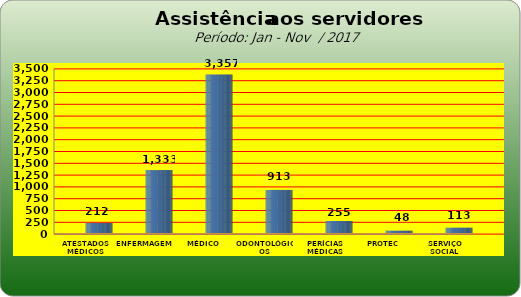
| Category | Series 0 |
|---|---|
| ATESTADOS MÉDICOS | 212 |
| ENFERMAGEM | 1333 |
| MÉDICO | 3357 |
| ODONTOLÓGICOS | 913 |
| PERÍCIAS MÉDICAS | 255 |
| PROTEC | 48 |
| SERVIÇO SOCIAL | 113 |